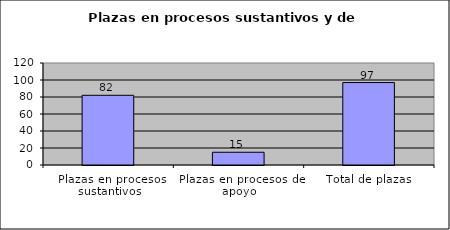
| Category | Series 0 |
|---|---|
| Plazas en procesos sustantivos | 82 |
| Plazas en procesos de apoyo | 15 |
| Total de plazas | 97 |